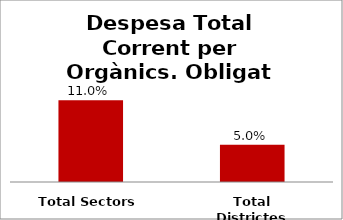
| Category | Series 0 |
|---|---|
| Total Sectors | 0.11 |
| Total Districtes | 0.05 |